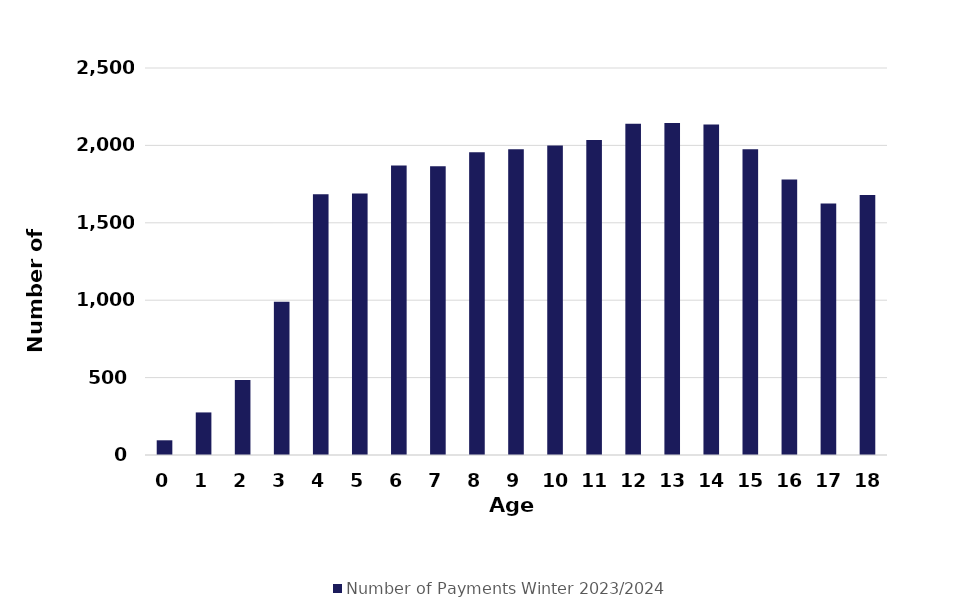
| Category | Number of Payments Winter 2023/2024 |
|---|---|
| 0.0 | 95 |
| 1.0 | 275 |
| 2.0 | 485 |
| 3.0 | 990 |
| 4.0 | 1685 |
| 5.0 | 1690 |
| 6.0 | 1870 |
| 7.0 | 1865 |
| 8.0 | 1955 |
| 9.0 | 1975 |
| 10.0 | 2000 |
| 11.0 | 2035 |
| 12.0 | 2140 |
| 13.0 | 2145 |
| 14.0 | 2135 |
| 15.0 | 1975 |
| 16.0 | 1780 |
| 17.0 | 1625 |
| 18.0 | 1680 |